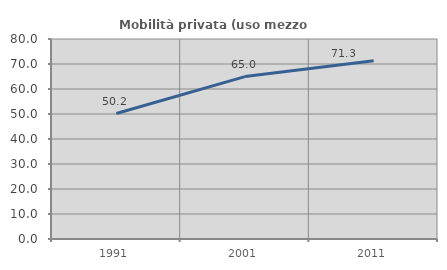
| Category | Mobilità privata (uso mezzo privato) |
|---|---|
| 1991.0 | 50.176 |
| 2001.0 | 64.96 |
| 2011.0 | 71.339 |